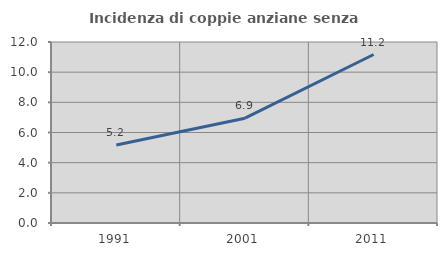
| Category | Incidenza di coppie anziane senza figli  |
|---|---|
| 1991.0 | 5.167 |
| 2001.0 | 6.948 |
| 2011.0 | 11.17 |